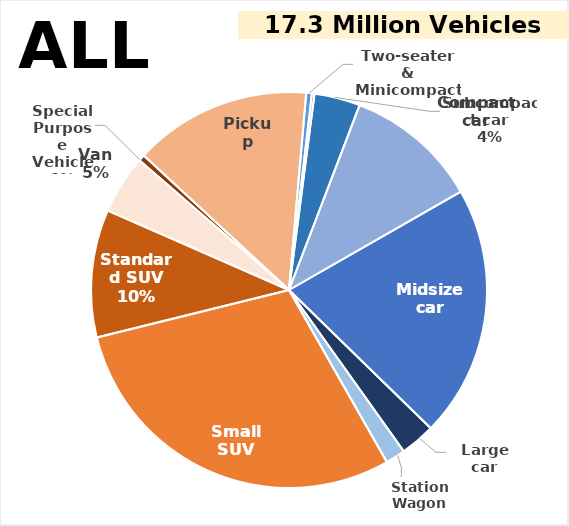
| Category | Series 0 |
|---|---|
| Two-seater & Minicompact | 0.005 |
| Minicompact car | 0.002 |
| Subcompact car | 0.037 |
| Compact car | 0.109 |
| Midsize car | 0.206 |
| Large car | 0.029 |
| Station Wagon | 0.016 |
| Small SUV | 0.294 |
| Standard SUV | 0.104 |
| Van | 0.048 |
| Special Purpose Vehicle | 0.005 |
| Pickup | 0.145 |